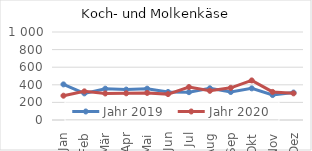
| Category | Jahr 2019 | Jahr 2020 |
|---|---|---|
| Jan | 404.56 | 276.119 |
| Feb | 302.475 | 325.409 |
| Mär | 355.718 | 301.631 |
| Apr | 345.577 | 303.538 |
| Mai | 356.04 | 307.636 |
| Jun | 318.508 | 294.149 |
| Jul | 316.347 | 374.514 |
| Aug | 360.194 | 331.491 |
| Sep | 318.235 | 365.703 |
| Okt | 359.404 | 449.753 |
| Nov | 283.548 | 318.902 |
| Dez | 311.966 | 302.789 |